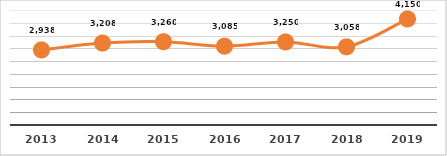
| Category | SERVICIOS TECNOLÓGICOS |
|---|---|
| 2013.0 | 2938 |
| 2014.0 | 3208 |
| 2015.0 | 3260 |
| 2016.0 | 3085 |
| 2017.0 | 3250 |
| 2018.0 | 3058 |
| 2019.0 | 4150 |